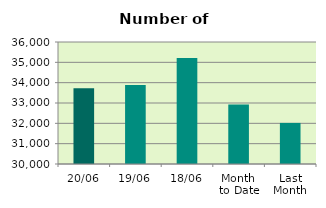
| Category | Series 0 |
|---|---|
| 20/06 | 33720 |
| 19/06 | 33886 |
| 18/06 | 35214 |
| Month 
to Date | 32928.571 |
| Last
Month | 32020.364 |